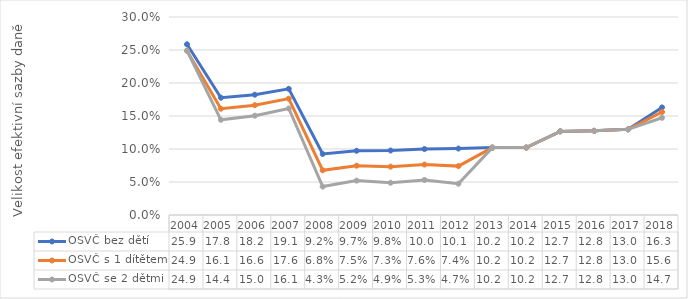
| Category | OSVČ bez dětí | OSVČ s 1 dítětem | OSVČ se 2 dětmi |
|---|---|---|---|
| 2004.0 | 0.259 | 0.249 | 0.249 |
| 2005.0 | 0.178 | 0.161 | 0.144 |
| 2006.0 | 0.182 | 0.166 | 0.15 |
| 2007.0 | 0.191 | 0.176 | 0.161 |
| 2008.0 | 0.092 | 0.068 | 0.043 |
| 2009.0 | 0.097 | 0.075 | 0.052 |
| 2010.0 | 0.098 | 0.073 | 0.049 |
| 2011.0 | 0.1 | 0.076 | 0.053 |
| 2012.0 | 0.101 | 0.074 | 0.047 |
| 2013.0 | 0.102 | 0.102 | 0.102 |
| 2014.0 | 0.102 | 0.102 | 0.102 |
| 2015.0 | 0.127 | 0.127 | 0.127 |
| 2016.0 | 0.128 | 0.128 | 0.128 |
| 2017.0 | 0.13 | 0.13 | 0.13 |
| 2018.0 | 0.163 | 0.156 | 0.147 |